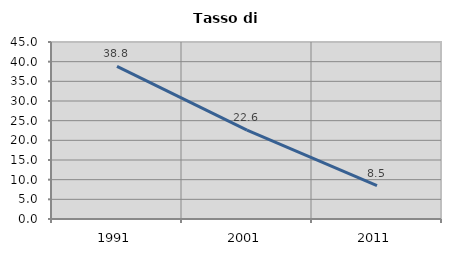
| Category | Tasso di disoccupazione   |
|---|---|
| 1991.0 | 38.801 |
| 2001.0 | 22.581 |
| 2011.0 | 8.511 |